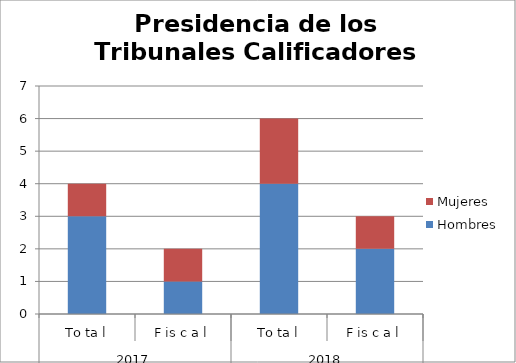
| Category | Hombres | Mujeres |
|---|---|---|
| 0 | 3 | 1 |
| 1 | 1 | 1 |
| 2 | 4 | 2 |
| 3 | 2 | 1 |